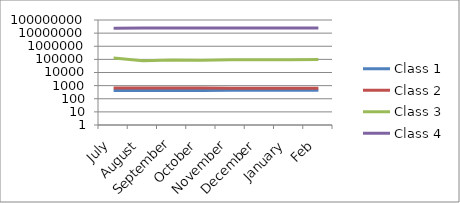
| Category | Class 1 | Class 2 | Class 3 | Class 4 |
|---|---|---|---|---|
| July | 427 | 658 | 125491 | 24038014 |
| August | 427 | 655 | 78827 | 24101362 |
| September | 429 | 650 | 88860 | 24110132 |
| October | 433 | 645 | 87615 | 24128941 |
| November | 437 | 636 | 95286 | 24146202 |
| December | 438 | 639 | 95544 | 24160382 |
| January | 441 | 638 | 95568 | 24173580 |
| Feb | 441 | 633 | 98369 | 24197837 |